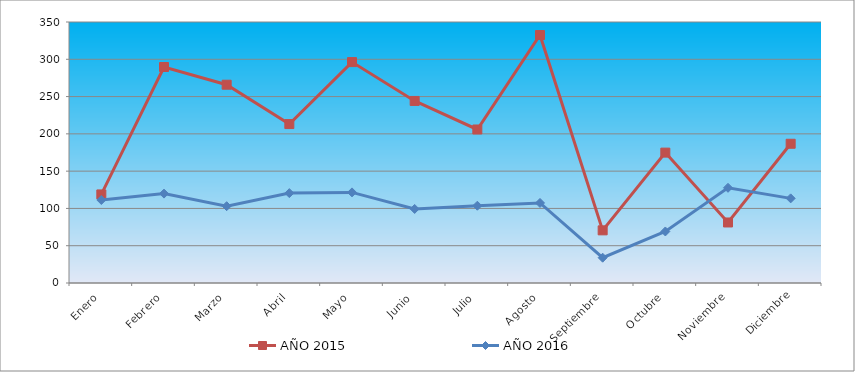
| Category | AÑO 2015 | AÑO 2016 |
|---|---|---|
| Enero | 118.764 | 111.317 |
| Febrero | 289.652 | 119.88 |
| Marzo | 265.899 | 103.014 |
| Abril | 213.115 | 120.539 |
| Mayo | 296.25 | 121.519 |
| Junio | 244.126 | 99.312 |
| Julio | 205.857 | 103.63 |
| Agosto | 332.539 | 107.331 |
| Septiembre | 70.599 | 33.927 |
| Octubre | 174.847 | 69.087 |
| Noviembre | 81.155 | 127.687 |
| Diciembre | 186.723 | 113.5 |